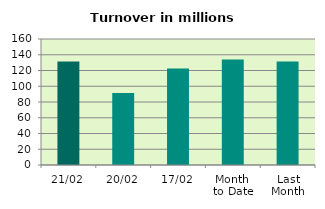
| Category | Series 0 |
|---|---|
| 21/02 | 131.337 |
| 20/02 | 91.571 |
| 17/02 | 122.527 |
| Month 
to Date | 134.01 |
| Last
Month | 131.402 |